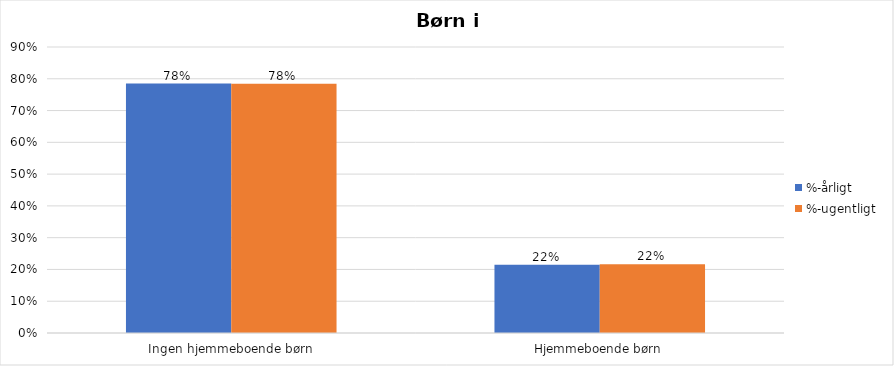
| Category | %-årligt | %-ugentligt |
|---|---|---|
| Ingen hjemmeboende børn | 0.785 | 0.784 |
| Hjemmeboende børn | 0.215 | 0.216 |